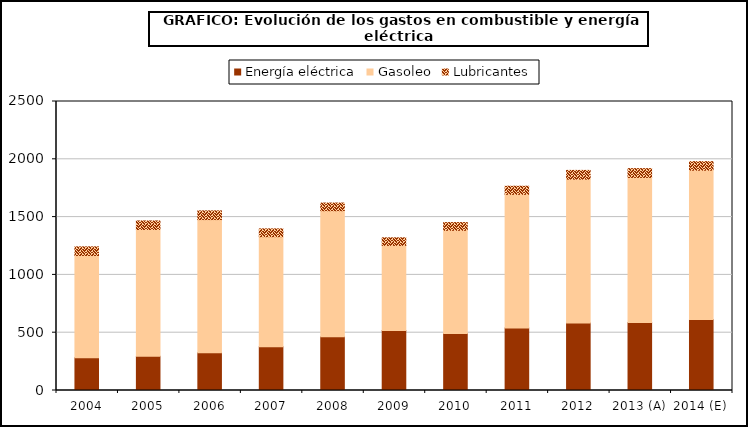
| Category | Energía eléctrica | Gasoleo | Lubricantes |
|---|---|---|---|
| 2004 | 283.576 | 883.982 | 75.129 |
| 2005 | 295.787 | 1096.919 | 74.037 |
| 2006 | 325.85 | 1152.791 | 75.344 |
| 2007 | 379.292 | 951.283 | 67.537 |
| 2008 | 465.509 | 1089.777 | 66.177 |
| 2009 | 519.861 | 735.254 | 65.464 |
| 2010 | 492.737 | 892.822 | 66.957 |
| 2011 | 541.39 | 1155.464 | 70.222 |
| 2012 | 583.37 | 1245.058 | 75.667 |
| 2013 (A) | 588.045 | 1255.037 | 76.273 |
| 2014 (E) | 614.517 | 1291.089 | 74.157 |